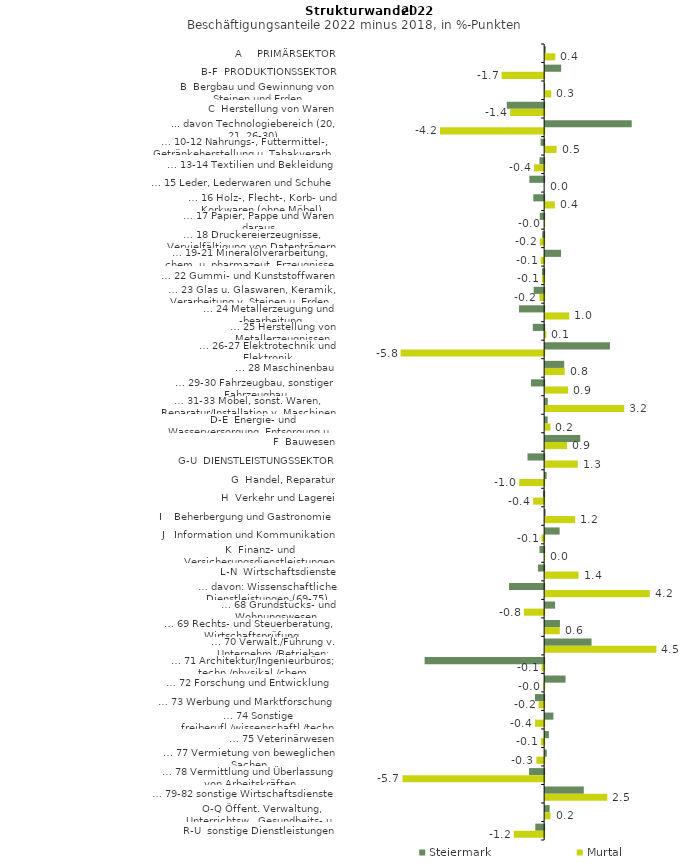
| Category | Steiermark | Murtal |
|---|---|---|
| A     PRIMÄRSEKTOR | 0.025 | 0.41 |
| B-F  PRODUKTIONSSEKTOR | 0.65 | -1.725 |
| B  Bergbau und Gewinnung von Steinen und Erden | -0.011 | 0.251 |
| C  Herstellung von Waren | -1.516 | -1.378 |
| ... davon Technologiebereich (20, 21, 26-30) | 3.513 | -4.226 |
| … 10-12 Nahrungs-, Futtermittel-, Getränkeherstellung u. Tabakverarb. | -0.143 | 0.464 |
| … 13-14 Textilien und Bekleidung | -0.189 | -0.408 |
| … 15 Leder, Lederwaren und Schuhe | -0.6 | 0 |
| … 16 Holz-, Flecht-, Korb- und Korkwaren (ohne Möbel)  | -0.44 | 0.394 |
| … 17 Papier, Pappe und Waren daraus  | -0.178 | -0.011 |
| … 18 Druckereierzeugnisse, Vervielfältigung von Datenträgern | -0.077 | -0.173 |
| … 19-21 Mineralölverarbeitung, chem. u. pharmazeut. Erzeugnisse | 0.646 | -0.142 |
| … 22 Gummi- und Kunststoffwaren | -0.089 | -0.088 |
| … 23 Glas u. Glaswaren, Keramik, Verarbeitung v. Steinen u. Erden  | -0.424 | -0.189 |
| … 24 Metallerzeugung und -bearbeitung | -1.019 | 0.979 |
| … 25 Herstellung von Metallerzeugnissen  | -0.459 | 0.05 |
| … 26-27 Elektrotechnik und Elektronik | 2.628 | -5.824 |
| … 28 Maschinenbau | 0.773 | 0.794 |
| … 29-30 Fahrzeugbau, sonstiger Fahrzeugbau | -0.534 | 0.931 |
| … 31-33 Möbel, sonst. Waren, Reparatur/Installation v. Maschinen | 0.106 | 3.209 |
| D-E  Energie- und Wasserversorgung, Entsorgung u. Rückgewinnung | 0.102 | 0.215 |
| F  Bauwesen | 1.424 | 0.89 |
| G-U  DIENSTLEISTUNGSSEKTOR | -0.676 | 1.324 |
| G  Handel, Reparatur | 0.059 | -1.013 |
| H  Verkehr und Lagerei | -0.05 | -0.444 |
| I    Beherbergung und Gastronomie | 0.02 | 1.218 |
| J   Information und Kommunikation | 0.588 | -0.107 |
| K  Finanz- und Versicherungsdienstleistungen | -0.188 | 0.001 |
| L-N  Wirtschaftsdienste | -0.252 | 1.355 |
| … davon: Wissenschaftliche Dienstleistungen (69-75) | -1.425 | 4.245 |
| … 68 Grundstücks- und Wohnungswesen  | 0.402 | -0.821 |
| … 69 Rechts- und Steuerberatung, Wirtschaftsprüfung | 0.6 | 0.594 |
| … 70 Verwalt./Führung v. Unternehm./Betrieben; Unternehmensberat. | 1.883 | 4.514 |
| … 71 Architektur/Ingenieurbüros; techn./physikal./chem. Untersuchung | -4.85 | -0.101 |
| … 72 Forschung und Entwicklung  | 0.828 | -0.032 |
| … 73 Werbung und Marktforschung | -0.372 | -0.225 |
| … 74 Sonstige freiberufl./wissenschaftl./techn. Tätigkeiten | 0.334 | -0.37 |
| … 75 Veterinärwesen | 0.152 | -0.135 |
| … 77 Vermietung von beweglichen Sachen  | 0.067 | -0.316 |
| … 78 Vermittlung und Überlassung von Arbeitskräften | -0.611 | -5.748 |
| … 79-82 sonstige Wirtschaftsdienste | 1.569 | 2.522 |
| O-Q Öffent. Verwaltung, Unterrichtsw., Gesundheits- u. Sozialwesen | 0.182 | 0.22 |
| R-U  sonstige Dienstleistungen | -0.359 | -1.23 |